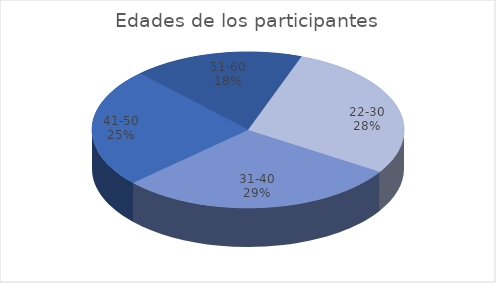
| Category | Series 0 |
|---|---|
| 22-30 | 45 |
| 31-40 | 46 |
| 41-50 | 39 |
| 51-60 | 28 |